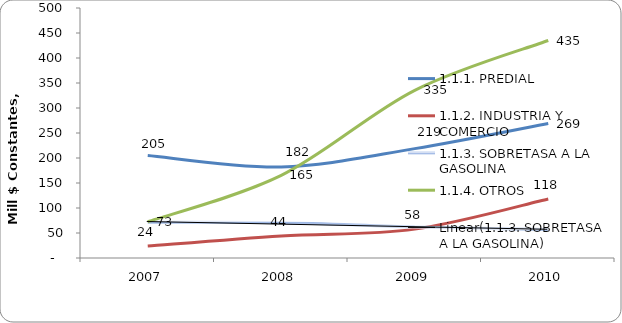
| Category | 1.1.1. PREDIAL | 1.1.2. INDUSTRIA Y COMERCIO | 1.1.3. SOBRETASA A LA GASOLINA | 1.1.4. OTROS |
|---|---|---|---|---|
| 2007 | 205.082 | 23.794 | 71.382 | 72.515 |
| 2008 | 182.054 | 44.198 | 70.506 | 165.216 |
| 2009 | 218.72 | 57.775 | 61.902 | 335.302 |
| 2010 | 269 | 118 | 57 | 435 |